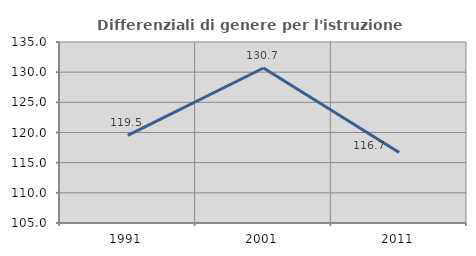
| Category | Differenziali di genere per l'istruzione superiore |
|---|---|
| 1991.0 | 119.531 |
| 2001.0 | 130.689 |
| 2011.0 | 116.679 |